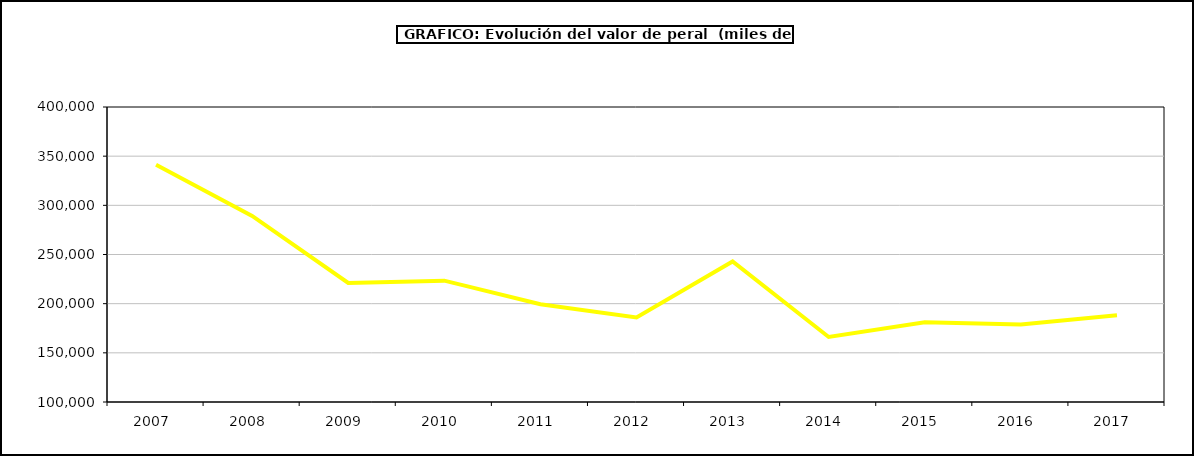
| Category | valor peral |
|---|---|
| 2007.0 | 341373.173 |
| 2008.0 | 289268.475 |
| 2009.0 | 221127.625 |
| 2010.0 | 223375.858 |
| 2011.0 | 199365.811 |
| 2012.0 | 186031.625 |
| 2013.0 | 242867.092 |
| 2014.0 | 166145.606 |
| 2015.0 | 181166 |
| 2016.0 | 178909 |
| 2017.0 | 188326.979 |